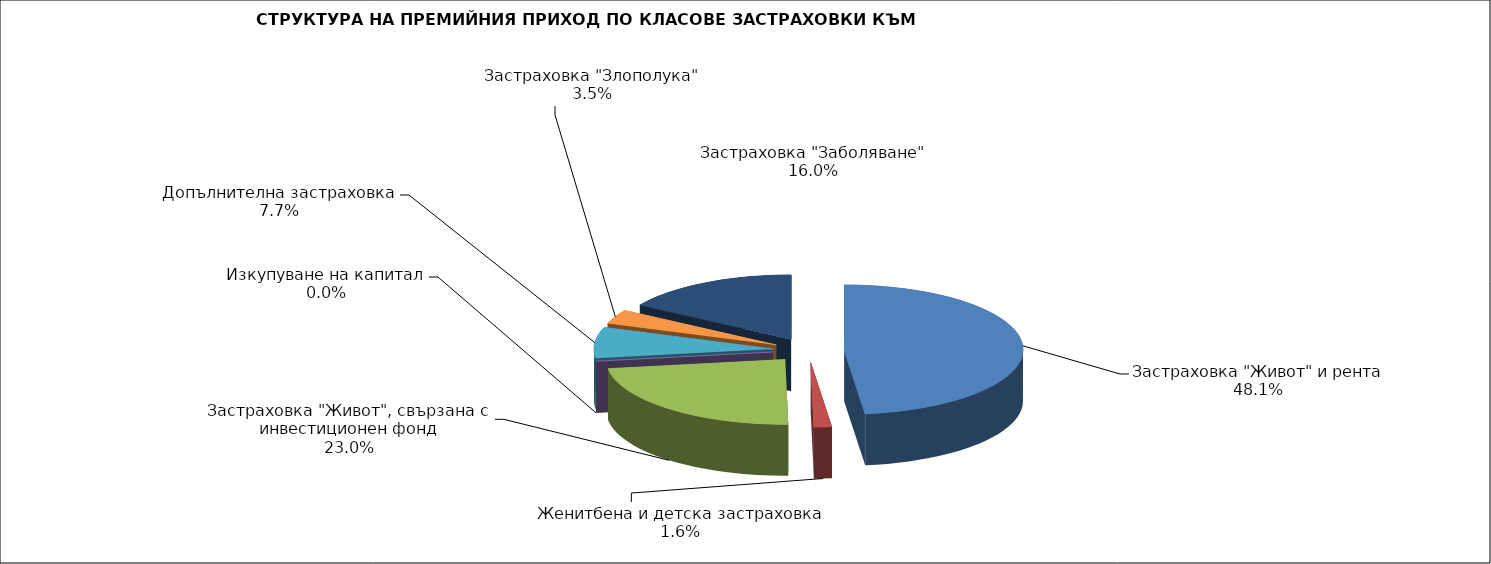
| Category | Series 0 |
|---|---|
| Застраховка "Живот" и рента | 173616271.744 |
| Женитбена и детска застраховка | 5816737.569 |
| Застраховка "Живот", свързана с инвестиционен фонд | 82986589.642 |
| Изкупуване на капитал | 0 |
| Допълнителна застраховка | 27744035.884 |
| Застраховка "Злополука" | 12745353.66 |
| Застраховка "Заболяване" | 57893434.12 |